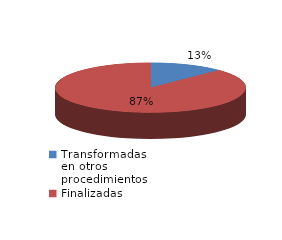
| Category | Series 0 |
|---|---|
| Transformadas en otros procedimientos | 979 |
| Finalizadas | 6800 |